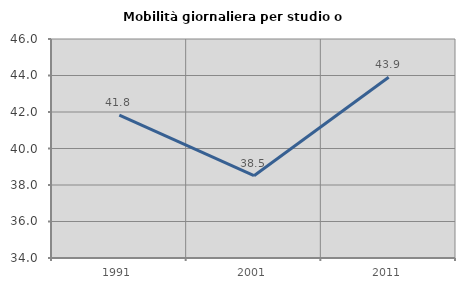
| Category | Mobilità giornaliera per studio o lavoro |
|---|---|
| 1991.0 | 41.834 |
| 2001.0 | 38.511 |
| 2011.0 | 43.907 |